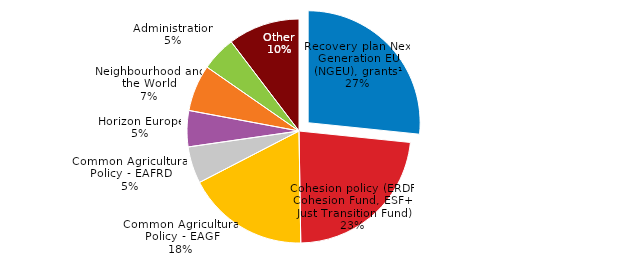
| Category | Share |
|---|---|
| Recovery plan Next Generation EU (NGEU), grants¹ | 26.634 |
| Cohesion policy (ERDF, Cohesion Fund, ESF+, Just Transition Fund) | 23.111 |
| Common Agricultural Policy - EAGF | 17.66 |
| Common Agricultural Policy - EAFRD | 5.317 |
| Horizon Europe | 5.218 |
| Neighbourhood and the World | 6.721 |
| Administration | 4.992 |
| Other | 10.348 |